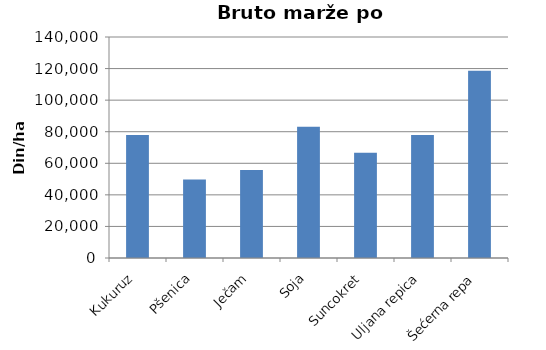
| Category | Series 0 |
|---|---|
| Kukuruz | 77886.808 |
| Pšenica | 49684.585 |
| Ječam | 55685.431 |
| Soja | 83068.688 |
| Suncokret | 66660.296 |
| Uljana repica | 77842.82 |
| Šećerna repa | 118597.353 |